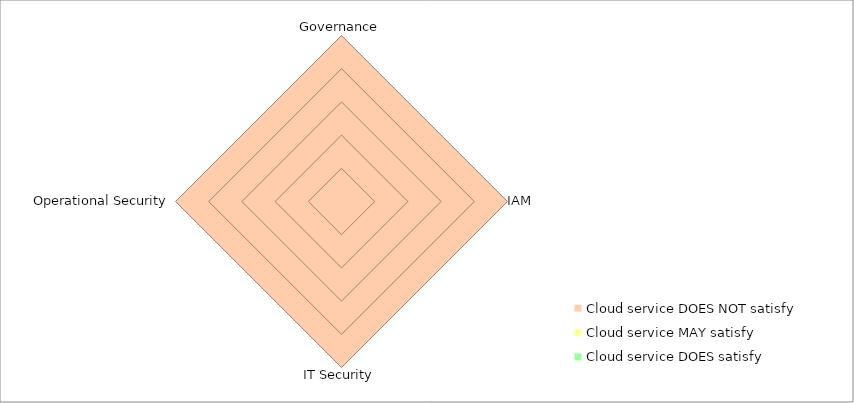
| Category | Cloud service DOES NOT satisfy | Cloud service MAY satisfy | Cloud service DOES satisfy |
|---|---|---|---|
| Governance | 1 | 0 | 0 |
| IAM | 1 | 0 | 0 |
| IT Security | 1 | 0 | 0 |
| Operational Security | 1 | 0 | 0 |